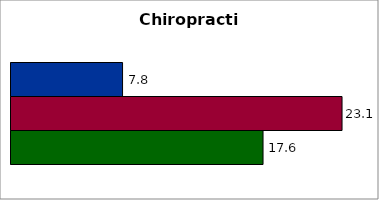
| Category | 50 states and D.C. | SREB states | State |
|---|---|---|---|
| 0 | 7.769 | 23.052 | 17.551 |